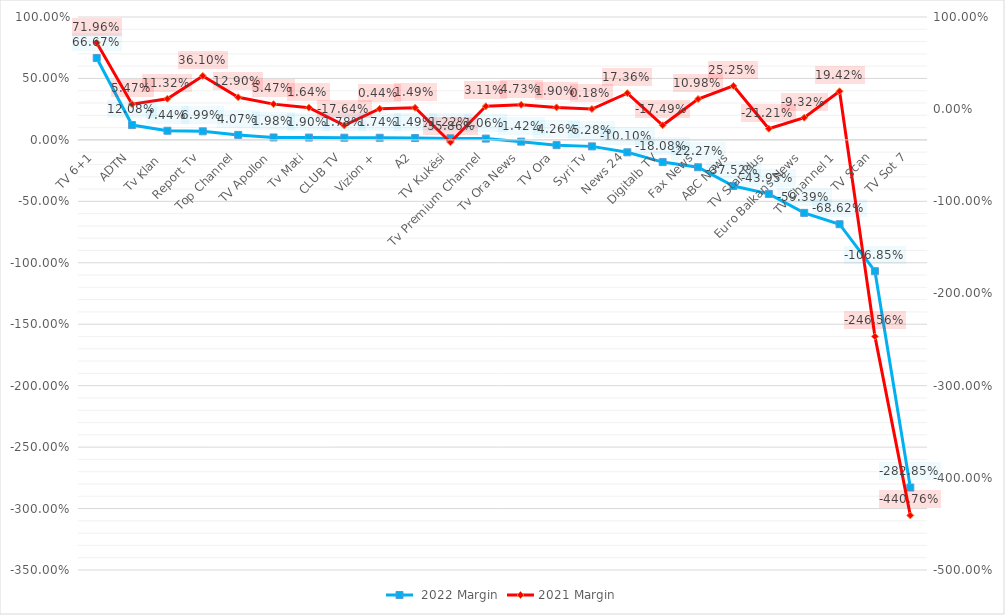
| Category |  2022 Margin |
|---|---|
| TV 6+1 | 0.667 |
| ADTN | 0.121 |
| Tv Klan  | 0.074 |
| Report Tv | 0.07 |
| Top Channel | 0.041 |
| TV Apollon | 0.02 |
| Tv Mati | 0.019 |
| CLUB TV | 0.018 |
| Vizion + | 0.017 |
| A2 | 0.015 |
| TV Kukësi | 0.012 |
| Tv Premium Channel | 0.011 |
| Tv Ora News | -0.014 |
| TV Ora | -0.043 |
| Syri Tv | -0.053 |
| News 24 | -0.101 |
| Digitalb TV | -0.181 |
| Fax News | -0.223 |
| ABC News | -0.375 |
| TV Star Plus | -0.44 |
| Euro Balkans News | -0.594 |
| TV Channel 1 | -0.686 |
| TV Scan | -1.069 |
| TV Sot 7 | -2.828 |